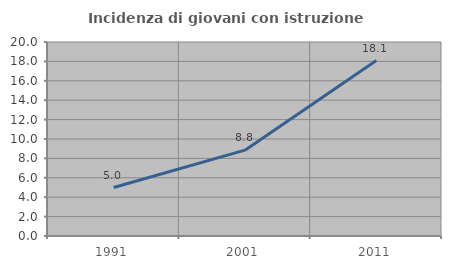
| Category | Incidenza di giovani con istruzione universitaria |
|---|---|
| 1991.0 | 4.995 |
| 2001.0 | 8.848 |
| 2011.0 | 18.092 |